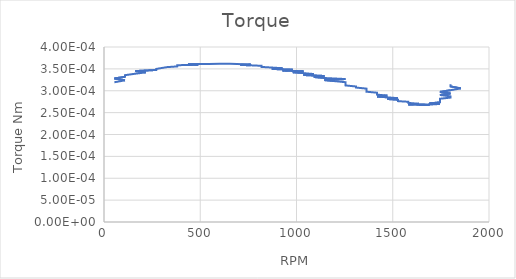
| Category | Series 0 |
|---|---|
| 54.0 | 0 |
| 109.0 | 0 |
| 54.0 | 0 |
| 109.0 | 0 |
| 109.0 | 0 |
| 163.0 | 0 |
| 218.0 | 0 |
| 163.0 | 0 |
| 272.0 | 0 |
| 272.0 | 0 |
| 272.0 | 0 |
| 327.0 | 0 |
| 381.0 | 0 |
| 381.0 | 0 |
| 381.0 | 0 |
| 490.0 | 0 |
| 436.0 | 0 |
| 490.0 | 0 |
| 545.0 | 0 |
| 545.0 | 0 |
| 600.0 | 0 |
| 600.0 | 0 |
| 654.0 | 0 |
| 654.0 | 0 |
| 654.0 | 0 |
| 763.0 | 0 |
| 709.0 | 0 |
| 763.0 | 0 |
| 818.0 | 0 |
| 818.0 | 0 |
| 818.0 | 0 |
| 872.0 | 0 |
| 927.0 | 0 |
| 872.0 | 0 |
| 981.0 | 0 |
| 927.0 | 0 |
| 1036.0 | 0 |
| 981.0 | 0 |
| 1036.0 | 0 |
| 1090.0 | 0 |
| 1036.0 | 0 |
| 1145.0 | 0 |
| 1090.0 | 0 |
| 1145.0 | 0 |
| 1254.0 | 0 |
| 1145.0 | 0 |
| 1200.0 | 0 |
| 1254.0 | 0 |
| 1254.0 | 0 |
| 1254.0 | 0 |
| 1254.0 | 0 |
| 1309.0 | 0 |
| 1309.0 | 0 |
| 1363.0 | 0 |
| 1363.0 | 0 |
| 1363.0 | 0 |
| 1363.0 | 0 |
| 1418.0 | 0 |
| 1418.0 | 0 |
| 1418.0 | 0 |
| 1472.0 | 0 |
| 1418.0 | 0 |
| 1472.0 | 0 |
| 1527.0 | 0 |
| 1472.0 | 0 |
| 1527.0 | 0 |
| 1527.0 | 0 |
| 1527.0 | 0 |
| 1581.0 | 0 |
| 1581.0 | 0 |
| 1581.0 | 0 |
| 1581.0 | 0 |
| 1636.0 | 0 |
| 1636.0 | 0 |
| 1581.0 | 0 |
| 1636.0 | 0 |
| 1636.0 | 0 |
| 1690.0 | 0 |
| 1636.0 | 0 |
| 1690.0 | 0 |
| 1636.0 | 0 |
| 1690.0 | 0 |
| 1690.0 | 0 |
| 1745.0 | 0 |
| 1690.0 | 0 |
| 1690.0 | 0 |
| 1745.0 | 0 |
| 1745.0 | 0 |
| 1745.0 | 0 |
| 1745.0 | 0 |
| 1745.0 | 0 |
| 1800.0 | 0 |
| 1800.0 | 0 |
| 1745.0 | 0 |
| 1800.0 | 0 |
| 1745.0 | 0 |
| 1800.0 | 0 |
| 1854.0 | 0 |
| 1800.0 | 0 |
| 1800.0 | 0 |